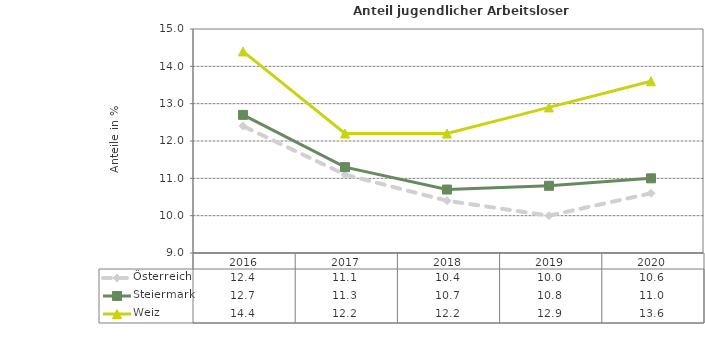
| Category | Österreich | Steiermark | Weiz |
|---|---|---|---|
| 2020.0 | 10.6 | 11 | 13.6 |
| 2019.0 | 10 | 10.8 | 12.9 |
| 2018.0 | 10.4 | 10.7 | 12.2 |
| 2017.0 | 11.1 | 11.3 | 12.2 |
| 2016.0 | 12.4 | 12.7 | 14.4 |